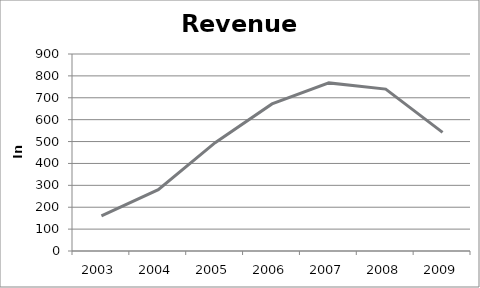
| Category | in Thousands |
|---|---|
| 2003.0 | 160 |
| 2004.0 | 280 |
| 2005.0 | 495 |
| 2006.0 | 672 |
| 2007.0 | 768 |
| 2008.0 | 739.5 |
| 2009.0 | 542 |